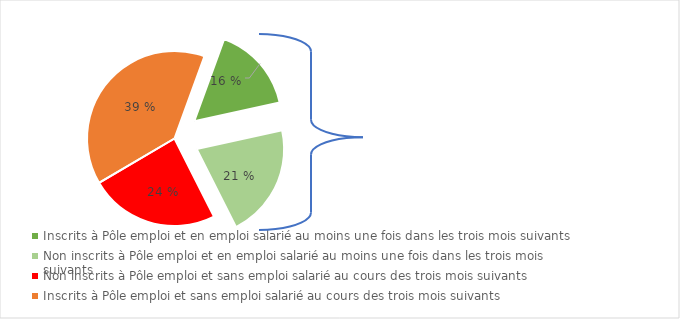
| Category | Series 0 |
|---|---|
| Inscrits à Pôle emploi et en emploi salarié au moins une fois dans les trois mois suivants | 0.16 |
| Non inscrits à Pôle emploi et en emploi salarié au moins une fois dans les trois mois suivants | 0.21 |
| Non inscrits à Pôle emploi et sans emploi salarié au cours des trois mois suivants | 0.24 |
| Inscrits à Pôle emploi et sans emploi salarié au cours des trois mois suivants | 0.39 |